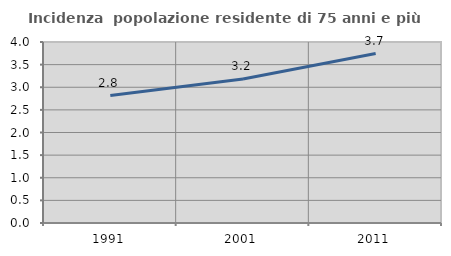
| Category | Incidenza  popolazione residente di 75 anni e più |
|---|---|
| 1991.0 | 2.816 |
| 2001.0 | 3.183 |
| 2011.0 | 3.745 |